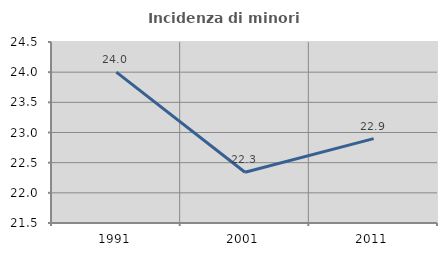
| Category | Incidenza di minori stranieri |
|---|---|
| 1991.0 | 24 |
| 2001.0 | 22.34 |
| 2011.0 | 22.899 |